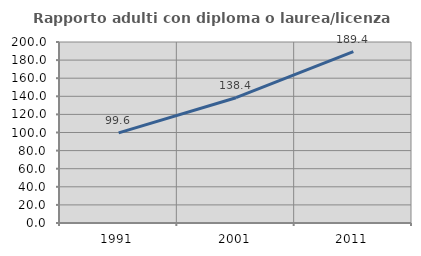
| Category | Rapporto adulti con diploma o laurea/licenza media  |
|---|---|
| 1991.0 | 99.581 |
| 2001.0 | 138.441 |
| 2011.0 | 189.433 |